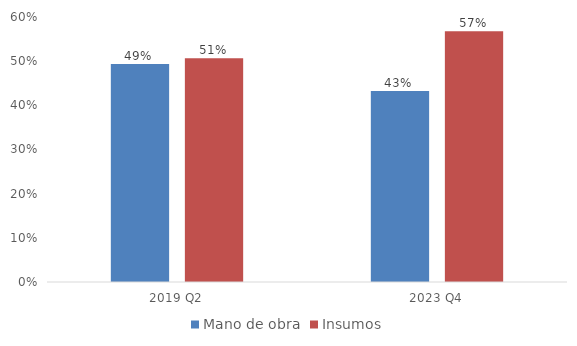
| Category | Mano de obra | Insumos |
|---|---|---|
| 2019 Q2 | 0.494 | 0.506 |
| 2023 Q4 | 0.432 | 0.568 |